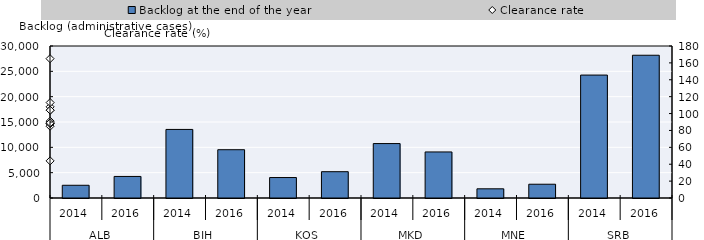
| Category | Backlog at the end of the year |
|---|---|
| 0 | 2511 |
| 1 | 4255 |
| 2 | 13535 |
| 3 | 9531 |
| 4 | 4039 |
| 5 | 5192 |
| 6 | 10743 |
| 7 | 9090 |
| 8 | 1815 |
| 9 | 2717 |
| 10 | 24262 |
| 11 | 28176 |